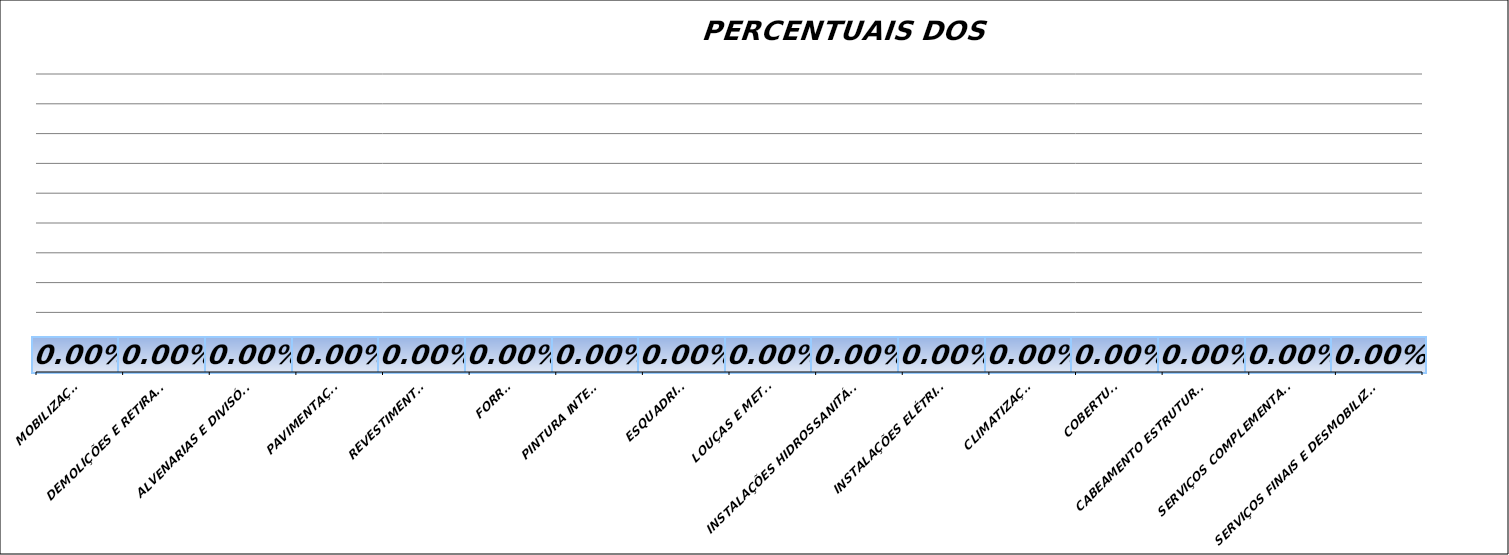
| Category | Series 0 |
|---|---|
| MOBILIZAÇÃO | 0 |
| DEMOLIÇÕES E RETIRADAS | 0 |
| ALVENARIAS E DIVISÓRIAS | 0 |
| PAVIMENTAÇÃO | 0 |
| REVESTIMENTOS | 0 |
| FORRO | 0 |
| PINTURA INTERNA | 0 |
| ESQUADRIAS | 0 |
| LOUÇAS E METAIS | 0 |
| INSTALAÇÕES HIDROSSANITÁRIAS | 0 |
| INSTALAÇÕES ELÉTRICAS | 0 |
| CLIMATIZAÇÃO | 0 |
| COBERTURA | 0 |
| CABEAMENTO ESTRUTURADO | 0 |
| SERVIÇOS COMPLEMENTARES | 0 |
| SERVIÇOS FINAIS E DESMOBILIZAÇÃO | 0 |